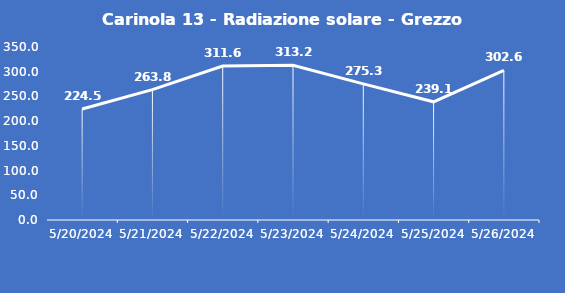
| Category | Carinola 13 - Radiazione solare - Grezzo (W/m2) |
|---|---|
| 5/20/24 | 224.5 |
| 5/21/24 | 263.8 |
| 5/22/24 | 311.6 |
| 5/23/24 | 313.2 |
| 5/24/24 | 275.3 |
| 5/25/24 | 239.1 |
| 5/26/24 | 302.6 |